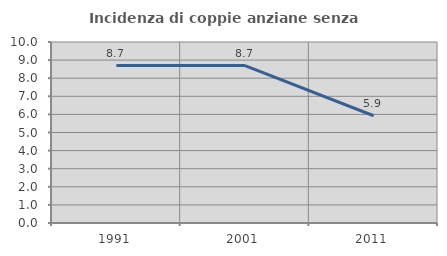
| Category | Incidenza di coppie anziane senza figli  |
|---|---|
| 1991.0 | 8.696 |
| 2001.0 | 8.696 |
| 2011.0 | 5.926 |